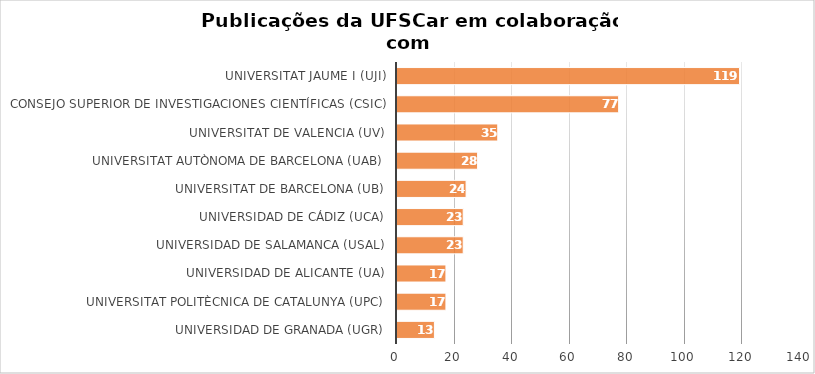
| Category | # Records |
|---|---|
| Universitat Jaume I (UJI) | 119 |
| Consejo Superior de Investigaciones Científicas (CSIC) | 77 |
| Universitat de Valencia (UV) | 35 |
| Universitat Autònoma de Barcelona (UAB) | 28 |
| Universitat de Barcelona (UB) | 24 |
| Universidad de Cádiz (UCA) | 23 |
| Universidad de Salamanca (USAL) | 23 |
| Universidad de Alicante (UA) | 17 |
| Universitat Politècnica de Catalunya (UPC) | 17 |
| Universidad de Granada (UGR) | 13 |